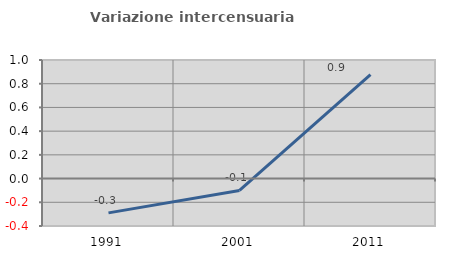
| Category | Variazione intercensuaria annua |
|---|---|
| 1991.0 | -0.289 |
| 2001.0 | -0.1 |
| 2011.0 | 0.878 |